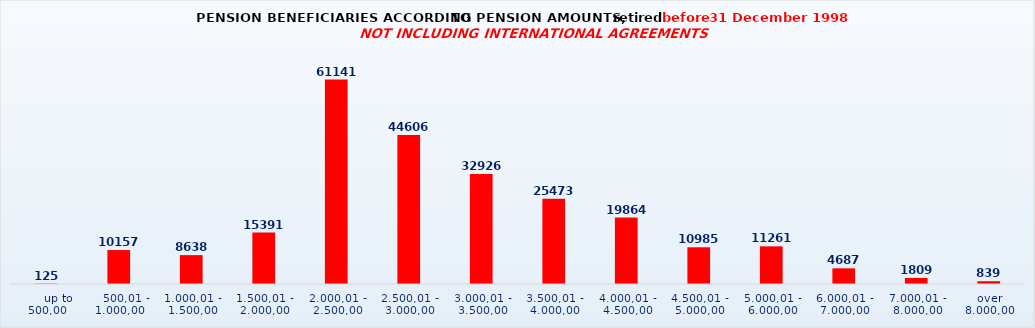
| Category | Series 0 |
|---|---|
|      up to 500,00 | 125 |
|    500,01 - 1.000,00 | 10157 |
| 1.000,01 - 1.500,00 | 8638 |
| 1.500,01 - 2.000,00 | 15391 |
| 2.000,01 - 2.500,00 | 61141 |
| 2.500,01 - 3.000,00 | 44606 |
| 3.000,01 - 3.500,00 | 32926 |
| 3.500,01 - 4.000,00 | 25473 |
| 4.000,01 - 4.500,00 | 19864 |
| 4.500,01 - 5.000,00 | 10985 |
| 5.000,01 - 6.000,00 | 11261 |
| 6.000,01 - 7.000,00 | 4687 |
| 7.000,01 - 8.000,00 | 1809 |
| over 8.000,00 | 839 |